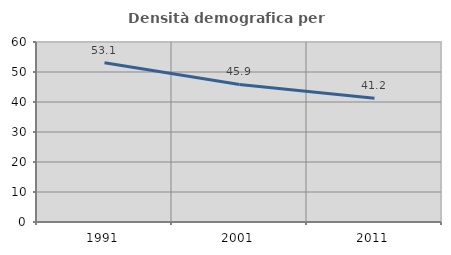
| Category | Densità demografica |
|---|---|
| 1991.0 | 53.109 |
| 2001.0 | 45.852 |
| 2011.0 | 41.234 |